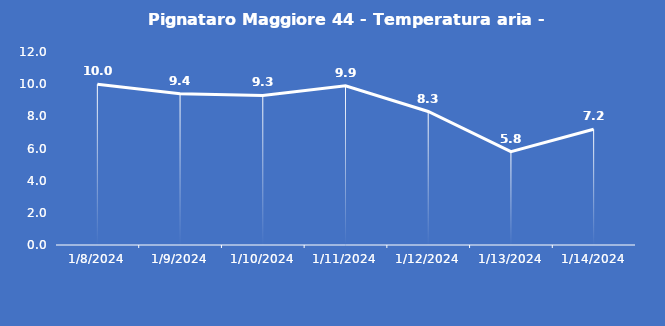
| Category | Pignataro Maggiore 44 - Temperatura aria - Grezzo (°C) |
|---|---|
| 1/8/24 | 10 |
| 1/9/24 | 9.4 |
| 1/10/24 | 9.3 |
| 1/11/24 | 9.9 |
| 1/12/24 | 8.3 |
| 1/13/24 | 5.8 |
| 1/14/24 | 7.2 |